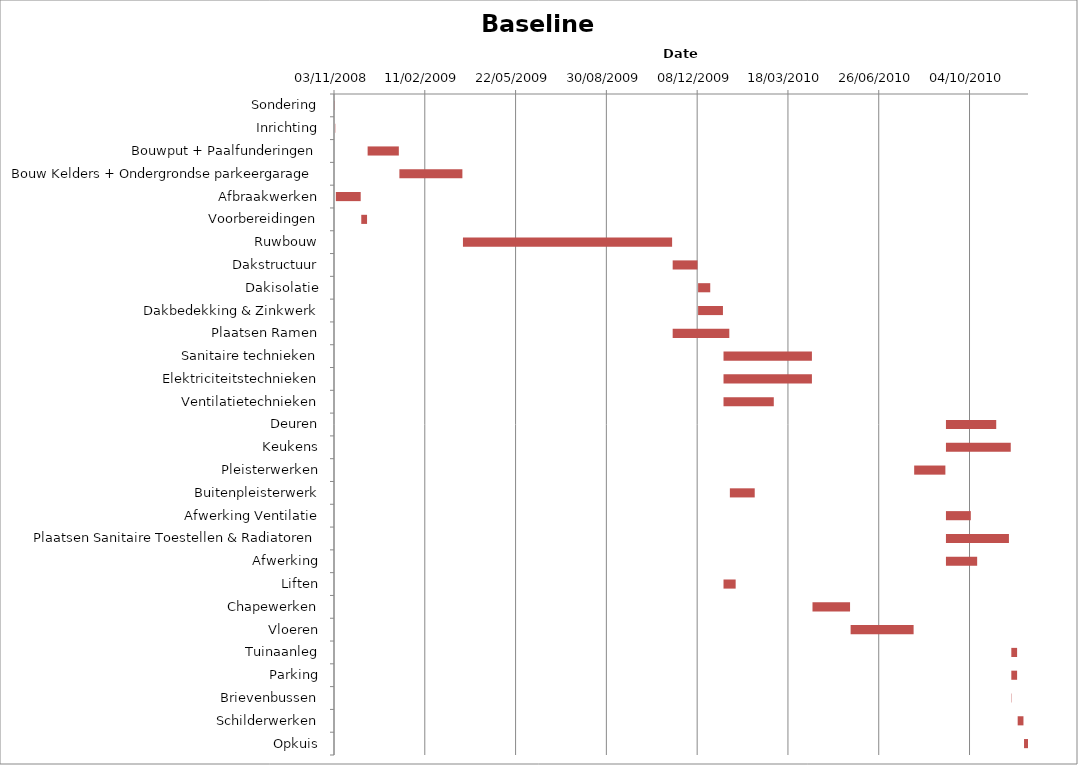
| Category | Baseline start | Actual duration |
|---|---|---|
| Sondering | 39755.333 | 0.375 |
| Inrichting | 39756.333 | 0.375 |
| Bouwput + Paalfunderingen | 39792.333 | 34.375 |
| Bouw Kelders + Ondergrondse parkeergarage | 39827.333 | 69.375 |
| Afbraakwerken | 39757.333 | 27.375 |
| Voorbereidingen | 39785.333 | 6.375 |
| Ruwbouw | 39897.333 | 230.375 |
| Dakstructuur | 40128.333 | 27.375 |
| Dakisolatie | 40156.333 | 13.375 |
| Dakbedekking & Zinkwerk | 40156.333 | 27.375 |
| Plaatsen Ramen | 40128.333 | 62.375 |
| Sanitaire technieken | 40184.333 | 97.375 |
| Elektriciteitstechnieken | 40184.333 | 97.375 |
| Ventilatietechnieken | 40184.333 | 55.375 |
| Deuren | 40429.333 | 55.375 |
| Keukens | 40429.333 | 71.375 |
| Pleisterwerken | 40394.333 | 34.375 |
| Buitenpleisterwerk | 40191.333 | 27.375 |
| Afwerking Ventilatie | 40429.333 | 27.375 |
| Plaatsen Sanitaire Toestellen & Radiatoren | 40429.333 | 69.375 |
| Afwerking | 40429.333 | 34.375 |
| Liften | 40184.333 | 13.375 |
| Chapewerken | 40282.333 | 41.375 |
| Vloeren | 40324.333 | 69.375 |
| Tuinaanleg | 40501.333 | 6.375 |
| Parking | 40501.333 | 6.375 |
| Brievenbussen | 40501.333 | 0.375 |
| Schilderwerken | 40508.333 | 6.375 |
| Opkuis | 40515.333 | 4.375 |